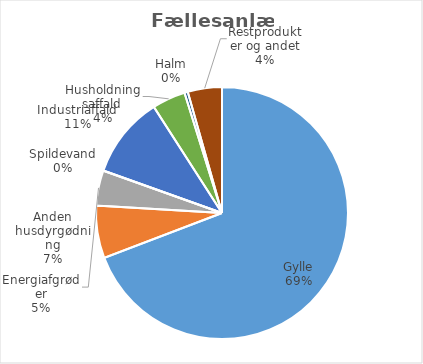
| Category | Series 0 |
|---|---|
| Gylle | 7489981.09 |
| Anden husdyrgødning | 728638.36 |
| Energiafgrøder | 487456.66 |
| Spildevand | 2553 |
| Industriaffald | 1129689.65 |
| Husholdningsaffald | 462593.79 |
| Halm | 46656.85 |
| Restprodukter og andet | 474641.12 |